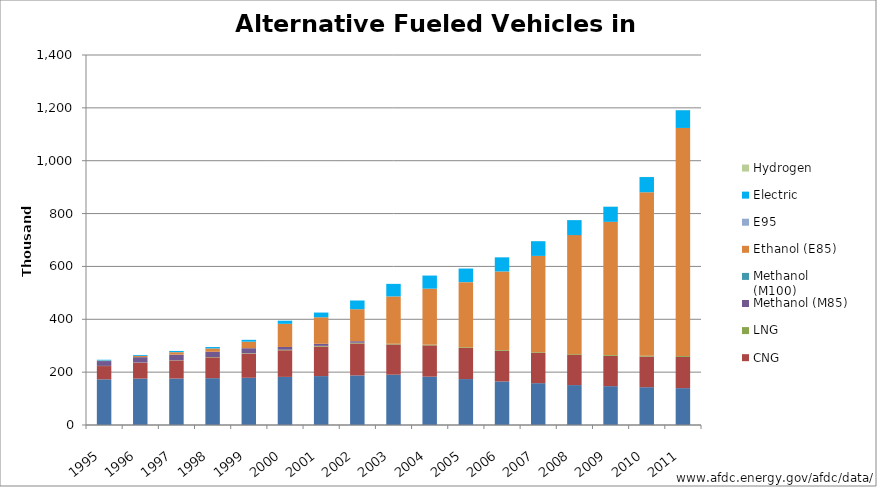
| Category | Propane | CNG | LNG | Methanol (M85) | Methanol (M100) | Ethanol (E85) | E95 | Electric | Hydrogen |
|---|---|---|---|---|---|---|---|---|---|
| 1995.0 | 172806 | 50218 | 603 | 18319 | 386 | 1527 | 136 | 2860 | 0 |
| 1996.0 | 175585 | 60144 | 663 | 20265 | 172 | 4536 | 361 | 3280 | 0 |
| 1997.0 | 175679 | 68571 | 813 | 21040 | 172 | 9130 | 347 | 4453 | 0 |
| 1998.0 | 177183 | 78782 | 1172 | 19648 | 200 | 12788 | 14 | 5243 | 0 |
| 1999.0 | 178610 | 91267 | 1681 | 18964 | 198 | 24604 | 14 | 6964 | 0 |
| 2000.0 | 181994 | 100750 | 2090 | 10426 | 0 | 87570 | 4 | 11830 | 0 |
| 2001.0 | 185053 | 111851 | 2576 | 7827 | 0 | 100303 | 0 | 17847 | 0 |
| 2002.0 | 187680 | 120839 | 2708 | 5873 | 0 | 120951 | 0 | 33047 | 0 |
| 2003.0 | 190369 | 114406 | 2640 | 0 | 0 | 179090 | 0 | 47485 | 9 |
| 2004.0 | 182864 | 118532 | 2717 | 0 | 0 | 211800 | 0 | 49536 | 43 |
| 2005.0 | 173795 | 117699 | 2748 | 0 | 0 | 246363 | 0 | 51398 | 119 |
| 2006.0 | 164846 | 116131 | 2798 | 0 | 0 | 297099 | 0 | 53526 | 159 |
| 2007.0 | 158254 | 114391 | 2781 | 0 | 0 | 364384 | 0 | 55730 | 223 |
| 2008.0 | 151049 | 113973 | 3101 | 0 | 0 | 450327 | 0 | 56901 | 313 |
| 2009.0 | 147030 | 114270 | 3176 | 0 | 0 | 504297 | 0 | 57185 | 357 |
| 2010.0 | 143037 | 115863 | 3354 | 0 | 0 | 618506 | 0 | 57462 | 421 |
| 2011.0 | 139477 | 118214 | 3436 | 0 | 0 | 862837 | 0 | 67295 | 527 |